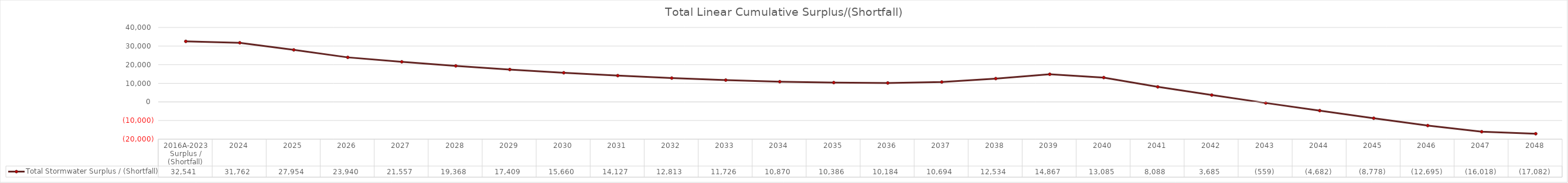
| Category | Total Stormwater Surplus / (Shortfall) |
|---|---|
| 2016A-2023 Surplus / (Shortfall) | 32541.351 |
| 2024 | 31761.948 |
| 2025 | 27953.87 |
| 2026 | 23939.747 |
| 2027 | 21556.504 |
| 2028 | 19367.604 |
| 2029 | 17409.129 |
| 2030 | 15660.328 |
| 2031 | 14126.503 |
| 2032 | 12813.07 |
| 2033 | 11725.556 |
| 2034 | 10869.601 |
| 2035 | 10386.471 |
| 2036 | 10183.932 |
| 2037 | 10694.421 |
| 2038 | 12533.646 |
| 2039 | 14866.976 |
| 2040 | 13085.018 |
| 2041 | 8087.543 |
| 2042 | 3685.189 |
| 2043 | -558.594 |
| 2044 | -4681.591 |
| 2045 | -8778.145 |
| 2046 | -12695.391 |
| 2047 | -16018.177 |
| 2048 | -17082.123 |